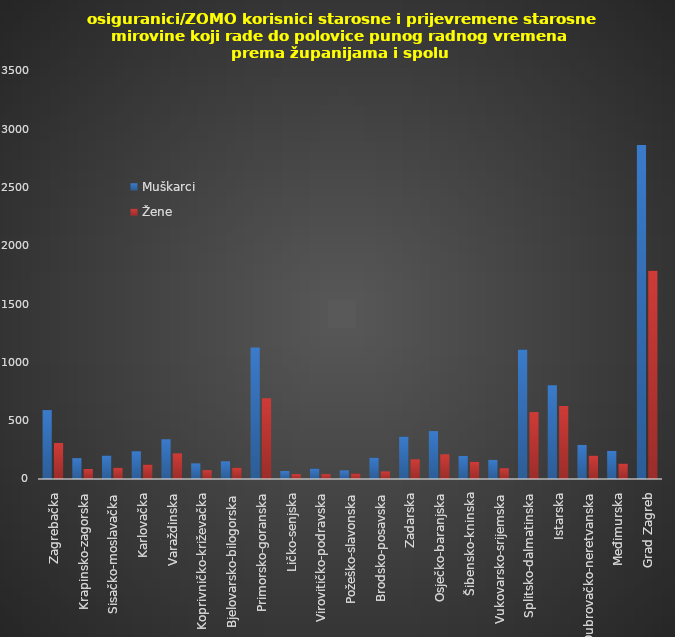
| Category | Muškarci | Žene |
|---|---|---|
| Zagrebačka | 591 | 309 |
| Krapinsko-zagorska | 179 | 86 |
| Sisačko-moslavačka | 201 | 96 |
| Karlovačka | 238 | 124 |
| Varaždinska | 341 | 220 |
| Koprivničko-križevačka | 134 | 76 |
| Bjelovarsko-bilogorska | 152 | 97 |
| Primorsko-goranska | 1129 | 693 |
| Ličko-senjska | 69 | 42 |
| Virovitičko-podravska | 90 | 42 |
| Požeško-slavonska | 74 | 47 |
| Brodsko-posavska | 183 | 65 |
| Zadarska | 364 | 169 |
| Osječko-baranjska | 411 | 212 |
| Šibensko-kninska | 197 | 147 |
| Vukovarsko-srijemska | 164 | 92 |
| Splitsko-dalmatinska | 1110 | 574 |
| Istarska | 804 | 626 |
| Dubrovačko-neretvanska | 292 | 200 |
| Međimurska | 241 | 132 |
| Grad Zagreb | 2866 | 1786 |